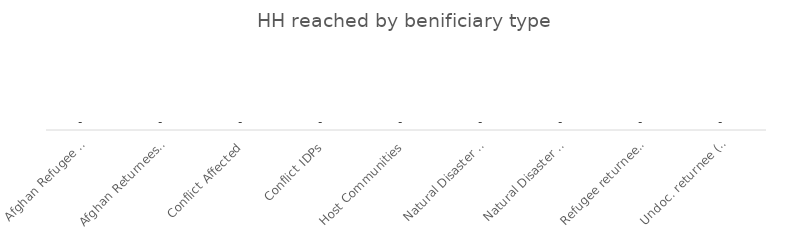
| Category | Series 0 |
|---|---|
| Afghan Refugee Returnees (Documented) | 0 |
| Afghan Returnees (Undocumented) | 0 |
| Conflict Affected | 0 |
| Conflict IDPs | 0 |
| Host Communities | 0 |
| Natural Disaster Affected | 0 |
| Natural Disaster Affected (Winter / Lean Season) | 0 |
| Refugee returnee (documented) - encashment center | 0 |
| Undoc. returnee (border) | 0 |